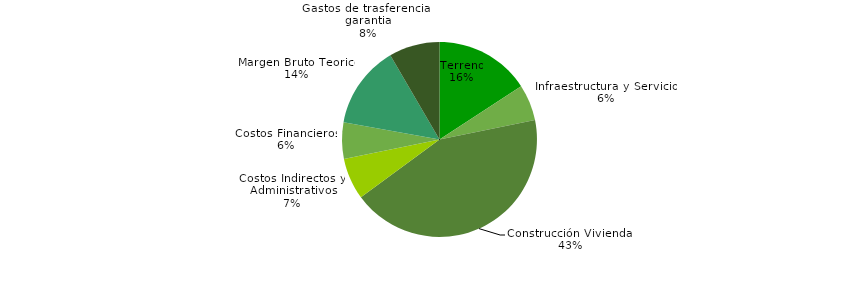
| Category | Series 0 |
|---|---|
| Terreno | 0.158 |
| Infraestructura y Servicios | 0.06 |
| Construcción Viviendas | 0.431 |
| Costos Indirectos y  Administrativos | 0.069 |
| Costos Financieros | 0.06 |
| Margen Bruto Teorico | 0.137 |
| Gastos de trasferencia y garantia | 0.084 |